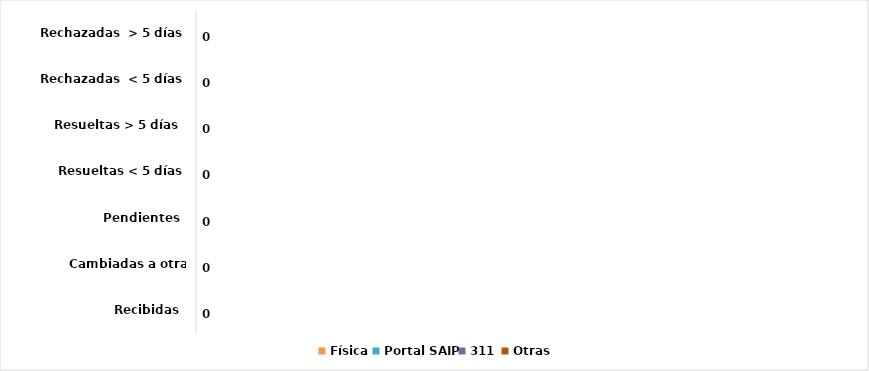
| Category | Física | Portal SAIP | 311 | Otras |
|---|---|---|---|---|
| Recibidas  | 0 | 0 | 0 | 0 |
| Cambiadas a otra Institución | 0 | 0 | 0 | 0 |
| Pendientes  | 0 | 0 | 0 | 0 |
| Resueltas < 5 días | 0 | 0 | 0 | 0 |
| Resueltas > 5 días  | 0 | 0 | 0 | 0 |
| Rechazadas  < 5 días | 0 | 0 | 0 | 0 |
| Rechazadas  > 5 días | 0 | 0 | 0 | 0 |